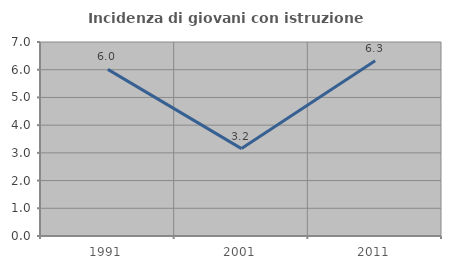
| Category | Incidenza di giovani con istruzione universitaria |
|---|---|
| 1991.0 | 6.011 |
| 2001.0 | 3.153 |
| 2011.0 | 6.322 |